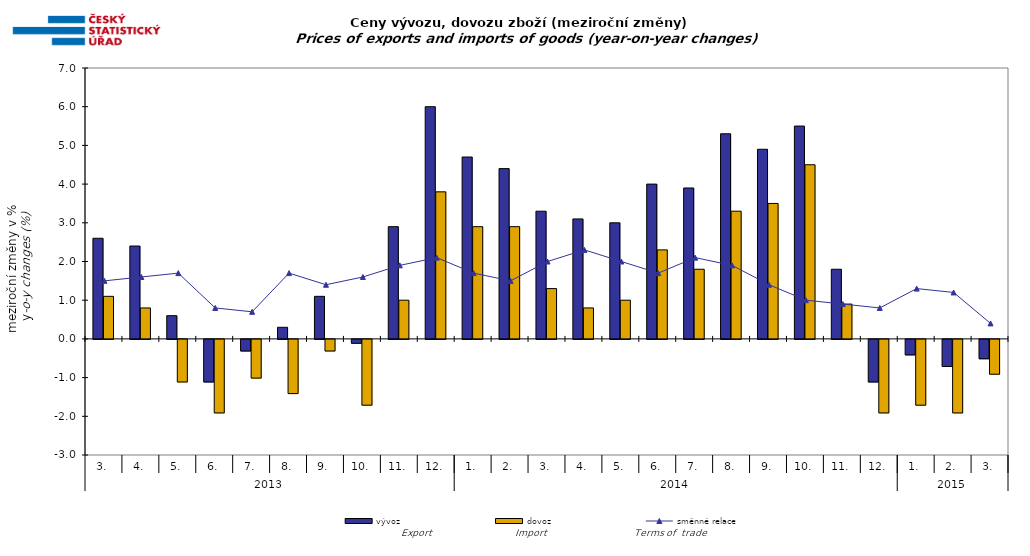
| Category | vývoz | dovoz |
|---|---|---|
| 0 | 2.6 | 1.1 |
| 1 | 2.4 | 0.8 |
| 2 | 0.6 | -1.1 |
| 3 | -1.1 | -1.9 |
| 4 | -0.3 | -1 |
| 5 | 0.3 | -1.4 |
| 6 | 1.1 | -0.3 |
| 7 | -0.1 | -1.7 |
| 8 | 2.9 | 1 |
| 9 | 6 | 3.8 |
| 10 | 4.7 | 2.9 |
| 11 | 4.4 | 2.9 |
| 12 | 3.3 | 1.3 |
| 13 | 3.1 | 0.8 |
| 14 | 3 | 1 |
| 15 | 4 | 2.3 |
| 16 | 3.9 | 1.8 |
| 17 | 5.3 | 3.3 |
| 18 | 4.9 | 3.5 |
| 19 | 5.5 | 4.5 |
| 20 | 1.8 | 0.9 |
| 21 | -1.1 | -1.9 |
| 22 | -0.4 | -1.7 |
| 23 | -0.7 | -1.9 |
| 24 | -0.5 | -0.9 |